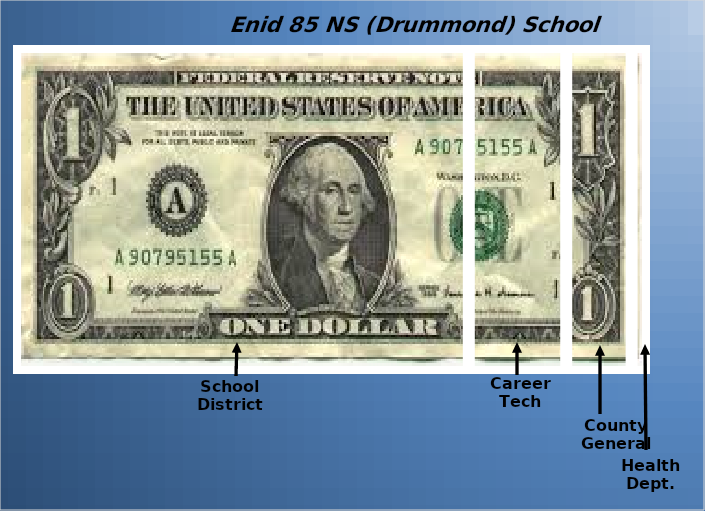
| Category | School District | Career Tech | County General | Health Dept. |
|---|---|---|---|---|
| 0 | 0.717 | 0.154 | 0.103 | 0.026 |